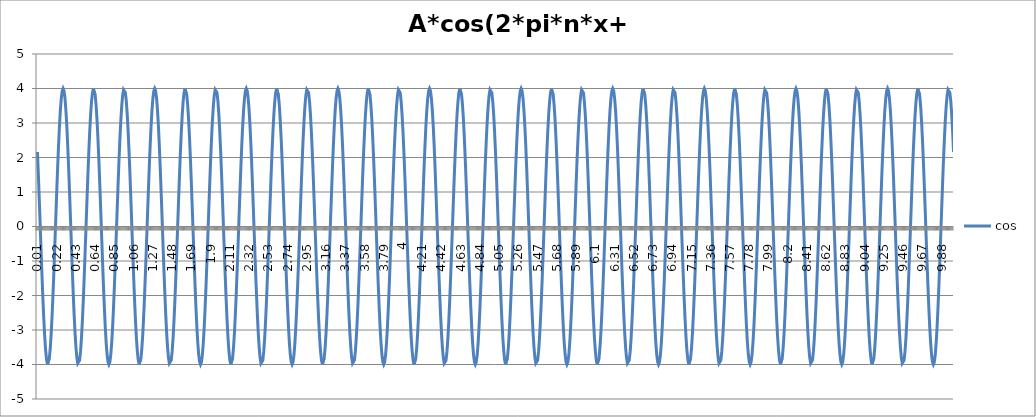
| Category | cos |
|---|---|
| 0.01 | 2.161 |
| 0.02 | 1.492 |
| 0.03 | 0.77 |
| 0.04 | 0.021 |
| 0.05 | -0.729 |
| 0.060000000000000005 | -1.453 |
| 0.07 | -2.125 |
| 0.08 | -2.723 |
| 0.09 | -3.224 |
| 0.09999999999999999 | -3.61 |
| 0.10999999999999999 | -3.869 |
| 0.11999999999999998 | -3.991 |
| 0.12999999999999998 | -3.971 |
| 0.13999999999999999 | -3.811 |
| 0.15 | -3.515 |
| 0.16 | -3.096 |
| 0.17 | -2.566 |
| 0.18000000000000002 | -1.946 |
| 0.19000000000000003 | -1.256 |
| 0.20000000000000004 | -0.522 |
| 0.21000000000000005 | 0.23 |
| 0.22000000000000006 | 0.974 |
| 0.23000000000000007 | 1.684 |
| 0.24000000000000007 | 2.334 |
| 0.25000000000000006 | 2.901 |
| 0.26000000000000006 | 3.366 |
| 0.2700000000000001 | 3.711 |
| 0.2800000000000001 | 3.925 |
| 0.2900000000000001 | 4 |
| 0.3000000000000001 | 3.933 |
| 0.3100000000000001 | 3.727 |
| 0.3200000000000001 | 3.389 |
| 0.3300000000000001 | 2.93 |
| 0.34000000000000014 | 2.368 |
| 0.35000000000000014 | 1.722 |
| 0.36000000000000015 | 1.015 |
| 0.37000000000000016 | 0.272 |
| 0.38000000000000017 | -0.48 |
| 0.3900000000000002 | -1.216 |
| 0.4000000000000002 | -1.908 |
| 0.4100000000000002 | -2.533 |
| 0.4200000000000002 | -3.068 |
| 0.4300000000000002 | -3.495 |
| 0.4400000000000002 | -3.798 |
| 0.45000000000000023 | -3.966 |
| 0.46000000000000024 | -3.993 |
| 0.47000000000000025 | -3.88 |
| 0.48000000000000026 | -3.628 |
| 0.49000000000000027 | -3.249 |
| 0.5000000000000002 | -2.754 |
| 0.5100000000000002 | -2.161 |
| 0.5200000000000002 | -1.492 |
| 0.5300000000000002 | -0.77 |
| 0.5400000000000003 | -0.021 |
| 0.5500000000000003 | 0.729 |
| 0.5600000000000003 | 1.453 |
| 0.5700000000000003 | 2.125 |
| 0.5800000000000003 | 2.723 |
| 0.5900000000000003 | 3.224 |
| 0.6000000000000003 | 3.61 |
| 0.6100000000000003 | 3.869 |
| 0.6200000000000003 | 3.991 |
| 0.6300000000000003 | 3.971 |
| 0.6400000000000003 | 3.811 |
| 0.6500000000000004 | 3.515 |
| 0.6600000000000004 | 3.096 |
| 0.6700000000000004 | 2.566 |
| 0.6800000000000004 | 1.946 |
| 0.6900000000000004 | 1.256 |
| 0.7000000000000004 | 0.522 |
| 0.7100000000000004 | -0.23 |
| 0.7200000000000004 | -0.974 |
| 0.7300000000000004 | -1.684 |
| 0.7400000000000004 | -2.334 |
| 0.7500000000000004 | -2.901 |
| 0.7600000000000005 | -3.366 |
| 0.7700000000000005 | -3.711 |
| 0.7800000000000005 | -3.925 |
| 0.7900000000000005 | -4 |
| 0.8000000000000005 | -3.933 |
| 0.8100000000000005 | -3.727 |
| 0.8200000000000005 | -3.389 |
| 0.8300000000000005 | -2.93 |
| 0.8400000000000005 | -2.368 |
| 0.8500000000000005 | -1.722 |
| 0.8600000000000005 | -1.015 |
| 0.8700000000000006 | -0.272 |
| 0.8800000000000006 | 0.48 |
| 0.8900000000000006 | 1.216 |
| 0.9000000000000006 | 1.908 |
| 0.9100000000000006 | 2.533 |
| 0.9200000000000006 | 3.068 |
| 0.9300000000000006 | 3.495 |
| 0.9400000000000006 | 3.798 |
| 0.9500000000000006 | 3.966 |
| 0.9600000000000006 | 3.993 |
| 0.9700000000000006 | 3.88 |
| 0.9800000000000006 | 3.628 |
| 0.9900000000000007 | 3.249 |
| 1.0000000000000007 | 2.754 |
| 1.0100000000000007 | 2.161 |
| 1.0200000000000007 | 1.492 |
| 1.0300000000000007 | 0.77 |
| 1.0400000000000007 | 0.021 |
| 1.0500000000000007 | -0.729 |
| 1.0600000000000007 | -1.453 |
| 1.0700000000000007 | -2.125 |
| 1.0800000000000007 | -2.723 |
| 1.0900000000000007 | -3.224 |
| 1.1000000000000008 | -3.61 |
| 1.1100000000000008 | -3.869 |
| 1.1200000000000008 | -3.991 |
| 1.1300000000000008 | -3.971 |
| 1.1400000000000008 | -3.811 |
| 1.1500000000000008 | -3.515 |
| 1.1600000000000008 | -3.096 |
| 1.1700000000000008 | -2.566 |
| 1.1800000000000008 | -1.946 |
| 1.1900000000000008 | -1.256 |
| 1.2000000000000008 | -0.522 |
| 1.2100000000000009 | 0.23 |
| 1.2200000000000009 | 0.974 |
| 1.2300000000000009 | 1.684 |
| 1.2400000000000009 | 2.334 |
| 1.2500000000000009 | 2.901 |
| 1.260000000000001 | 3.366 |
| 1.270000000000001 | 3.711 |
| 1.280000000000001 | 3.925 |
| 1.290000000000001 | 4 |
| 1.300000000000001 | 3.933 |
| 1.310000000000001 | 3.727 |
| 1.320000000000001 | 3.389 |
| 1.330000000000001 | 2.93 |
| 1.340000000000001 | 2.368 |
| 1.350000000000001 | 1.722 |
| 1.360000000000001 | 1.015 |
| 1.370000000000001 | 0.272 |
| 1.380000000000001 | -0.48 |
| 1.390000000000001 | -1.216 |
| 1.400000000000001 | -1.908 |
| 1.410000000000001 | -2.533 |
| 1.420000000000001 | -3.068 |
| 1.430000000000001 | -3.495 |
| 1.440000000000001 | -3.798 |
| 1.450000000000001 | -3.966 |
| 1.460000000000001 | -3.993 |
| 1.470000000000001 | -3.88 |
| 1.480000000000001 | -3.628 |
| 1.490000000000001 | -3.249 |
| 1.500000000000001 | -2.754 |
| 1.5100000000000011 | -2.161 |
| 1.5200000000000011 | -1.492 |
| 1.5300000000000011 | -0.77 |
| 1.5400000000000011 | -0.021 |
| 1.5500000000000012 | 0.729 |
| 1.5600000000000012 | 1.453 |
| 1.5700000000000012 | 2.125 |
| 1.5800000000000012 | 2.723 |
| 1.5900000000000012 | 3.224 |
| 1.6000000000000012 | 3.61 |
| 1.6100000000000012 | 3.869 |
| 1.6200000000000012 | 3.991 |
| 1.6300000000000012 | 3.971 |
| 1.6400000000000012 | 3.811 |
| 1.6500000000000012 | 3.515 |
| 1.6600000000000013 | 3.096 |
| 1.6700000000000013 | 2.566 |
| 1.6800000000000013 | 1.946 |
| 1.6900000000000013 | 1.256 |
| 1.7000000000000013 | 0.522 |
| 1.7100000000000013 | -0.23 |
| 1.7200000000000013 | -0.974 |
| 1.7300000000000013 | -1.684 |
| 1.7400000000000013 | -2.334 |
| 1.7500000000000013 | -2.901 |
| 1.7600000000000013 | -3.366 |
| 1.7700000000000014 | -3.711 |
| 1.7800000000000014 | -3.925 |
| 1.7900000000000014 | -4 |
| 1.8000000000000014 | -3.933 |
| 1.8100000000000014 | -3.727 |
| 1.8200000000000014 | -3.389 |
| 1.8300000000000014 | -2.93 |
| 1.8400000000000014 | -2.368 |
| 1.8500000000000014 | -1.722 |
| 1.8600000000000014 | -1.015 |
| 1.8700000000000014 | -0.272 |
| 1.8800000000000014 | 0.48 |
| 1.8900000000000015 | 1.216 |
| 1.9000000000000015 | 1.908 |
| 1.9100000000000015 | 2.533 |
| 1.9200000000000015 | 3.068 |
| 1.9300000000000015 | 3.495 |
| 1.9400000000000015 | 3.798 |
| 1.9500000000000015 | 3.966 |
| 1.9600000000000015 | 3.993 |
| 1.9700000000000015 | 3.88 |
| 1.9800000000000015 | 3.628 |
| 1.9900000000000015 | 3.249 |
| 2.0000000000000013 | 2.754 |
| 2.010000000000001 | 2.161 |
| 2.020000000000001 | 1.492 |
| 2.0300000000000007 | 0.77 |
| 2.0400000000000005 | 0.021 |
| 2.0500000000000003 | -0.729 |
| 2.06 | -1.453 |
| 2.07 | -2.125 |
| 2.0799999999999996 | -2.723 |
| 2.0899999999999994 | -3.224 |
| 2.099999999999999 | -3.61 |
| 2.109999999999999 | -3.869 |
| 2.1199999999999988 | -3.991 |
| 2.1299999999999986 | -3.971 |
| 2.1399999999999983 | -3.811 |
| 2.149999999999998 | -3.515 |
| 2.159999999999998 | -3.096 |
| 2.1699999999999977 | -2.566 |
| 2.1799999999999975 | -1.946 |
| 2.1899999999999973 | -1.256 |
| 2.199999999999997 | -0.522 |
| 2.209999999999997 | 0.23 |
| 2.2199999999999966 | 0.974 |
| 2.2299999999999964 | 1.684 |
| 2.239999999999996 | 2.334 |
| 2.249999999999996 | 2.901 |
| 2.259999999999996 | 3.366 |
| 2.2699999999999956 | 3.711 |
| 2.2799999999999954 | 3.925 |
| 2.289999999999995 | 4 |
| 2.299999999999995 | 3.933 |
| 2.3099999999999947 | 3.727 |
| 2.3199999999999945 | 3.389 |
| 2.3299999999999943 | 2.93 |
| 2.339999999999994 | 2.368 |
| 2.349999999999994 | 1.722 |
| 2.3599999999999937 | 1.015 |
| 2.3699999999999934 | 0.272 |
| 2.3799999999999932 | -0.48 |
| 2.389999999999993 | -1.216 |
| 2.399999999999993 | -1.908 |
| 2.4099999999999926 | -2.533 |
| 2.4199999999999924 | -3.068 |
| 2.429999999999992 | -3.495 |
| 2.439999999999992 | -3.798 |
| 2.4499999999999917 | -3.966 |
| 2.4599999999999915 | -3.993 |
| 2.4699999999999913 | -3.88 |
| 2.479999999999991 | -3.628 |
| 2.489999999999991 | -3.249 |
| 2.4999999999999907 | -2.754 |
| 2.5099999999999905 | -2.161 |
| 2.5199999999999902 | -1.492 |
| 2.52999999999999 | -0.77 |
| 2.53999999999999 | -0.021 |
| 2.5499999999999896 | 0.729 |
| 2.5599999999999894 | 1.453 |
| 2.569999999999989 | 2.125 |
| 2.579999999999989 | 2.723 |
| 2.5899999999999888 | 3.224 |
| 2.5999999999999885 | 3.61 |
| 2.6099999999999883 | 3.869 |
| 2.619999999999988 | 3.991 |
| 2.629999999999988 | 3.971 |
| 2.6399999999999877 | 3.811 |
| 2.6499999999999875 | 3.515 |
| 2.6599999999999873 | 3.096 |
| 2.669999999999987 | 2.566 |
| 2.679999999999987 | 1.946 |
| 2.6899999999999866 | 1.256 |
| 2.6999999999999864 | 0.522 |
| 2.709999999999986 | -0.23 |
| 2.719999999999986 | -0.974 |
| 2.7299999999999858 | -1.684 |
| 2.7399999999999856 | -2.334 |
| 2.7499999999999853 | -2.901 |
| 2.759999999999985 | -3.366 |
| 2.769999999999985 | -3.711 |
| 2.7799999999999847 | -3.925 |
| 2.7899999999999845 | -4 |
| 2.7999999999999843 | -3.933 |
| 2.809999999999984 | -3.727 |
| 2.819999999999984 | -3.389 |
| 2.8299999999999836 | -2.93 |
| 2.8399999999999834 | -2.368 |
| 2.849999999999983 | -1.722 |
| 2.859999999999983 | -1.015 |
| 2.869999999999983 | -0.272 |
| 2.8799999999999826 | 0.48 |
| 2.8899999999999824 | 1.216 |
| 2.899999999999982 | 1.908 |
| 2.909999999999982 | 2.533 |
| 2.9199999999999817 | 3.068 |
| 2.9299999999999815 | 3.495 |
| 2.9399999999999813 | 3.798 |
| 2.949999999999981 | 3.966 |
| 2.959999999999981 | 3.993 |
| 2.9699999999999807 | 3.88 |
| 2.9799999999999804 | 3.628 |
| 2.9899999999999802 | 3.249 |
| 2.99999999999998 | 2.754 |
| 3.00999999999998 | 2.161 |
| 3.0199999999999796 | 1.492 |
| 3.0299999999999794 | 0.77 |
| 3.039999999999979 | 0.021 |
| 3.049999999999979 | -0.729 |
| 3.0599999999999787 | -1.453 |
| 3.0699999999999785 | -2.125 |
| 3.0799999999999783 | -2.723 |
| 3.089999999999978 | -3.224 |
| 3.099999999999978 | -3.61 |
| 3.1099999999999777 | -3.869 |
| 3.1199999999999775 | -3.991 |
| 3.1299999999999772 | -3.971 |
| 3.139999999999977 | -3.811 |
| 3.149999999999977 | -3.515 |
| 3.1599999999999766 | -3.096 |
| 3.1699999999999764 | -2.566 |
| 3.179999999999976 | -1.946 |
| 3.189999999999976 | -1.256 |
| 3.1999999999999758 | -0.522 |
| 3.2099999999999755 | 0.23 |
| 3.2199999999999753 | 0.974 |
| 3.229999999999975 | 1.684 |
| 3.239999999999975 | 2.334 |
| 3.2499999999999747 | 2.901 |
| 3.2599999999999745 | 3.366 |
| 3.2699999999999743 | 3.711 |
| 3.279999999999974 | 3.925 |
| 3.289999999999974 | 4 |
| 3.2999999999999736 | 3.933 |
| 3.3099999999999734 | 3.727 |
| 3.319999999999973 | 3.389 |
| 3.329999999999973 | 2.93 |
| 3.3399999999999728 | 2.368 |
| 3.3499999999999726 | 1.722 |
| 3.3599999999999723 | 1.015 |
| 3.369999999999972 | 0.272 |
| 3.379999999999972 | -0.48 |
| 3.3899999999999717 | -1.216 |
| 3.3999999999999715 | -1.908 |
| 3.4099999999999713 | -2.533 |
| 3.419999999999971 | -3.068 |
| 3.429999999999971 | -3.495 |
| 3.4399999999999706 | -3.798 |
| 3.4499999999999704 | -3.966 |
| 3.45999999999997 | -3.993 |
| 3.46999999999997 | -3.88 |
| 3.47999999999997 | -3.628 |
| 3.4899999999999696 | -3.249 |
| 3.4999999999999694 | -2.754 |
| 3.509999999999969 | -2.161 |
| 3.519999999999969 | -1.492 |
| 3.5299999999999687 | -0.77 |
| 3.5399999999999685 | -0.021 |
| 3.5499999999999683 | 0.729 |
| 3.559999999999968 | 1.453 |
| 3.569999999999968 | 2.125 |
| 3.5799999999999677 | 2.723 |
| 3.5899999999999674 | 3.224 |
| 3.5999999999999672 | 3.61 |
| 3.609999999999967 | 3.869 |
| 3.619999999999967 | 3.991 |
| 3.6299999999999666 | 3.971 |
| 3.6399999999999664 | 3.811 |
| 3.649999999999966 | 3.515 |
| 3.659999999999966 | 3.096 |
| 3.6699999999999657 | 2.566 |
| 3.6799999999999655 | 1.946 |
| 3.6899999999999653 | 1.256 |
| 3.699999999999965 | 0.522 |
| 3.709999999999965 | -0.23 |
| 3.7199999999999647 | -0.974 |
| 3.7299999999999645 | -1.684 |
| 3.7399999999999642 | -2.334 |
| 3.749999999999964 | -2.901 |
| 3.759999999999964 | -3.366 |
| 3.7699999999999636 | -3.711 |
| 3.7799999999999634 | -3.925 |
| 3.789999999999963 | -4 |
| 3.799999999999963 | -3.933 |
| 3.8099999999999627 | -3.727 |
| 3.8199999999999625 | -3.389 |
| 3.8299999999999623 | -2.93 |
| 3.839999999999962 | -2.368 |
| 3.849999999999962 | -1.722 |
| 3.8599999999999617 | -1.015 |
| 3.8699999999999615 | -0.272 |
| 3.8799999999999613 | 0.48 |
| 3.889999999999961 | 1.216 |
| 3.899999999999961 | 1.908 |
| 3.9099999999999606 | 2.533 |
| 3.9199999999999604 | 3.068 |
| 3.92999999999996 | 3.495 |
| 3.93999999999996 | 3.798 |
| 3.9499999999999598 | 3.966 |
| 3.9599999999999596 | 3.993 |
| 3.9699999999999593 | 3.88 |
| 3.979999999999959 | 3.628 |
| 3.989999999999959 | 3.249 |
| 3.9999999999999587 | 2.754 |
| 4.009999999999959 | 2.161 |
| 4.019999999999959 | 1.492 |
| 4.0299999999999585 | 0.77 |
| 4.039999999999958 | 0.021 |
| 4.049999999999958 | -0.729 |
| 4.059999999999958 | -1.453 |
| 4.069999999999958 | -2.125 |
| 4.079999999999957 | -2.723 |
| 4.089999999999957 | -3.224 |
| 4.099999999999957 | -3.61 |
| 4.109999999999957 | -3.869 |
| 4.119999999999957 | -3.991 |
| 4.129999999999956 | -3.971 |
| 4.139999999999956 | -3.811 |
| 4.149999999999956 | -3.515 |
| 4.159999999999956 | -3.096 |
| 4.1699999999999555 | -2.566 |
| 4.179999999999955 | -1.946 |
| 4.189999999999955 | -1.256 |
| 4.199999999999955 | -0.522 |
| 4.209999999999955 | 0.23 |
| 4.2199999999999545 | 0.974 |
| 4.229999999999954 | 1.684 |
| 4.239999999999954 | 2.334 |
| 4.249999999999954 | 2.901 |
| 4.259999999999954 | 3.366 |
| 4.269999999999953 | 3.711 |
| 4.279999999999953 | 3.925 |
| 4.289999999999953 | 4 |
| 4.299999999999953 | 3.933 |
| 4.3099999999999525 | 3.727 |
| 4.319999999999952 | 3.389 |
| 4.329999999999952 | 2.93 |
| 4.339999999999952 | 2.368 |
| 4.349999999999952 | 1.722 |
| 4.3599999999999515 | 1.015 |
| 4.369999999999951 | 0.272 |
| 4.379999999999951 | -0.48 |
| 4.389999999999951 | -1.216 |
| 4.399999999999951 | -1.908 |
| 4.40999999999995 | -2.533 |
| 4.41999999999995 | -3.068 |
| 4.42999999999995 | -3.495 |
| 4.43999999999995 | -3.798 |
| 4.4499999999999496 | -3.966 |
| 4.459999999999949 | -3.993 |
| 4.469999999999949 | -3.88 |
| 4.479999999999949 | -3.628 |
| 4.489999999999949 | -3.249 |
| 4.4999999999999485 | -2.754 |
| 4.509999999999948 | -2.161 |
| 4.519999999999948 | -1.492 |
| 4.529999999999948 | -0.77 |
| 4.539999999999948 | -0.021 |
| 4.549999999999947 | 0.729 |
| 4.559999999999947 | 1.453 |
| 4.569999999999947 | 2.125 |
| 4.579999999999947 | 2.723 |
| 4.589999999999947 | 3.224 |
| 4.599999999999946 | 3.61 |
| 4.609999999999946 | 3.869 |
| 4.619999999999946 | 3.991 |
| 4.629999999999946 | 3.971 |
| 4.6399999999999455 | 3.811 |
| 4.649999999999945 | 3.515 |
| 4.659999999999945 | 3.096 |
| 4.669999999999945 | 2.566 |
| 4.679999999999945 | 1.946 |
| 4.689999999999944 | 1.256 |
| 4.699999999999944 | 0.522 |
| 4.709999999999944 | -0.23 |
| 4.719999999999944 | -0.974 |
| 4.729999999999944 | -1.684 |
| 4.739999999999943 | -2.334 |
| 4.749999999999943 | -2.901 |
| 4.759999999999943 | -3.366 |
| 4.769999999999943 | -3.711 |
| 4.7799999999999425 | -3.925 |
| 4.789999999999942 | -4 |
| 4.799999999999942 | -3.933 |
| 4.809999999999942 | -3.727 |
| 4.819999999999942 | -3.389 |
| 4.8299999999999415 | -2.93 |
| 4.839999999999941 | -2.368 |
| 4.849999999999941 | -1.722 |
| 4.859999999999941 | -1.015 |
| 4.869999999999941 | -0.272 |
| 4.87999999999994 | 0.48 |
| 4.88999999999994 | 1.216 |
| 4.89999999999994 | 1.908 |
| 4.90999999999994 | 2.533 |
| 4.9199999999999395 | 3.068 |
| 4.929999999999939 | 3.495 |
| 4.939999999999939 | 3.798 |
| 4.949999999999939 | 3.966 |
| 4.959999999999939 | 3.993 |
| 4.9699999999999385 | 3.88 |
| 4.979999999999938 | 3.628 |
| 4.989999999999938 | 3.249 |
| 4.999999999999938 | 2.754 |
| 5.009999999999938 | 2.161 |
| 5.019999999999937 | 1.492 |
| 5.029999999999937 | 0.77 |
| 5.039999999999937 | 0.021 |
| 5.049999999999937 | -0.729 |
| 5.0599999999999365 | -1.453 |
| 5.069999999999936 | -2.125 |
| 5.079999999999936 | -2.723 |
| 5.089999999999936 | -3.224 |
| 5.099999999999936 | -3.61 |
| 5.1099999999999355 | -3.869 |
| 5.119999999999935 | -3.991 |
| 5.129999999999935 | -3.971 |
| 5.139999999999935 | -3.811 |
| 5.149999999999935 | -3.515 |
| 5.159999999999934 | -3.096 |
| 5.169999999999934 | -2.566 |
| 5.179999999999934 | -1.946 |
| 5.189999999999934 | -1.256 |
| 5.199999999999934 | -0.522 |
| 5.209999999999933 | 0.23 |
| 5.219999999999933 | 0.974 |
| 5.229999999999933 | 1.684 |
| 5.239999999999933 | 2.334 |
| 5.2499999999999325 | 2.901 |
| 5.259999999999932 | 3.366 |
| 5.269999999999932 | 3.711 |
| 5.279999999999932 | 3.925 |
| 5.289999999999932 | 4 |
| 5.299999999999931 | 3.933 |
| 5.309999999999931 | 3.727 |
| 5.319999999999931 | 3.389 |
| 5.329999999999931 | 2.93 |
| 5.339999999999931 | 2.368 |
| 5.34999999999993 | 1.722 |
| 5.35999999999993 | 1.015 |
| 5.36999999999993 | 0.272 |
| 5.37999999999993 | -0.48 |
| 5.3899999999999295 | -1.216 |
| 5.399999999999929 | -1.908 |
| 5.409999999999929 | -2.533 |
| 5.419999999999929 | -3.068 |
| 5.429999999999929 | -3.495 |
| 5.4399999999999284 | -3.798 |
| 5.449999999999928 | -3.966 |
| 5.459999999999928 | -3.993 |
| 5.469999999999928 | -3.88 |
| 5.479999999999928 | -3.628 |
| 5.489999999999927 | -3.249 |
| 5.499999999999927 | -2.754 |
| 5.509999999999927 | -2.161 |
| 5.519999999999927 | -1.492 |
| 5.5299999999999265 | -0.77 |
| 5.539999999999926 | -0.021 |
| 5.549999999999926 | 0.729 |
| 5.559999999999926 | 1.453 |
| 5.569999999999926 | 2.125 |
| 5.5799999999999255 | 2.723 |
| 5.589999999999925 | 3.224 |
| 5.599999999999925 | 3.61 |
| 5.609999999999925 | 3.869 |
| 5.619999999999925 | 3.991 |
| 5.629999999999924 | 3.971 |
| 5.639999999999924 | 3.811 |
| 5.649999999999924 | 3.515 |
| 5.659999999999924 | 3.096 |
| 5.6699999999999235 | 2.566 |
| 5.679999999999923 | 1.946 |
| 5.689999999999923 | 1.256 |
| 5.699999999999923 | 0.522 |
| 5.709999999999923 | -0.23 |
| 5.7199999999999225 | -0.974 |
| 5.729999999999922 | -1.684 |
| 5.739999999999922 | -2.334 |
| 5.749999999999922 | -2.901 |
| 5.759999999999922 | -3.366 |
| 5.769999999999921 | -3.711 |
| 5.779999999999921 | -3.925 |
| 5.789999999999921 | -4 |
| 5.799999999999921 | -3.933 |
| 5.809999999999921 | -3.727 |
| 5.81999999999992 | -3.389 |
| 5.82999999999992 | -2.93 |
| 5.83999999999992 | -2.368 |
| 5.84999999999992 | -1.722 |
| 5.8599999999999195 | -1.015 |
| 5.869999999999919 | -0.272 |
| 5.879999999999919 | 0.48 |
| 5.889999999999919 | 1.216 |
| 5.899999999999919 | 1.908 |
| 5.909999999999918 | 2.533 |
| 5.919999999999918 | 3.068 |
| 5.929999999999918 | 3.495 |
| 5.939999999999918 | 3.798 |
| 5.949999999999918 | 3.966 |
| 5.959999999999917 | 3.993 |
| 5.969999999999917 | 3.88 |
| 5.979999999999917 | 3.628 |
| 5.989999999999917 | 3.249 |
| 5.9999999999999165 | 2.754 |
| 6.009999999999916 | 2.161 |
| 6.019999999999916 | 1.492 |
| 6.029999999999916 | 0.77 |
| 6.039999999999916 | 0.021 |
| 6.0499999999999154 | -0.729 |
| 6.059999999999915 | -1.453 |
| 6.069999999999915 | -2.125 |
| 6.079999999999915 | -2.723 |
| 6.089999999999915 | -3.224 |
| 6.099999999999914 | -3.61 |
| 6.109999999999914 | -3.869 |
| 6.119999999999914 | -3.991 |
| 6.129999999999914 | -3.971 |
| 6.1399999999999135 | -3.811 |
| 6.149999999999913 | -3.515 |
| 6.159999999999913 | -3.096 |
| 6.169999999999913 | -2.566 |
| 6.179999999999913 | -1.946 |
| 6.1899999999999125 | -1.256 |
| 6.199999999999912 | -0.522 |
| 6.209999999999912 | 0.23 |
| 6.219999999999912 | 0.974 |
| 6.229999999999912 | 1.684 |
| 6.239999999999911 | 2.334 |
| 6.249999999999911 | 2.901 |
| 6.259999999999911 | 3.366 |
| 6.269999999999911 | 3.711 |
| 6.2799999999999105 | 3.925 |
| 6.28999999999991 | 4 |
| 6.29999999999991 | 3.933 |
| 6.30999999999991 | 3.727 |
| 6.31999999999991 | 3.389 |
| 6.3299999999999095 | 2.93 |
| 6.339999999999909 | 2.368 |
| 6.349999999999909 | 1.722 |
| 6.359999999999909 | 1.015 |
| 6.369999999999909 | 0.272 |
| 6.379999999999908 | -0.48 |
| 6.389999999999908 | -1.216 |
| 6.399999999999908 | -1.908 |
| 6.409999999999908 | -2.533 |
| 6.419999999999908 | -3.068 |
| 6.429999999999907 | -3.495 |
| 6.439999999999907 | -3.798 |
| 6.449999999999907 | -3.966 |
| 6.459999999999907 | -3.993 |
| 6.4699999999999065 | -3.88 |
| 6.479999999999906 | -3.628 |
| 6.489999999999906 | -3.249 |
| 6.499999999999906 | -2.754 |
| 6.509999999999906 | -2.161 |
| 6.519999999999905 | -1.492 |
| 6.529999999999905 | -0.77 |
| 6.539999999999905 | -0.021 |
| 6.549999999999905 | 0.729 |
| 6.559999999999905 | 1.453 |
| 6.569999999999904 | 2.125 |
| 6.579999999999904 | 2.723 |
| 6.589999999999904 | 3.224 |
| 6.599999999999904 | 3.61 |
| 6.6099999999999035 | 3.869 |
| 6.619999999999903 | 3.991 |
| 6.629999999999903 | 3.971 |
| 6.639999999999903 | 3.811 |
| 6.649999999999903 | 3.515 |
| 6.659999999999902 | 3.096 |
| 6.669999999999902 | 2.566 |
| 6.679999999999902 | 1.946 |
| 6.689999999999902 | 1.256 |
| 6.699999999999902 | 0.522 |
| 6.709999999999901 | -0.23 |
| 6.719999999999901 | -0.974 |
| 6.729999999999901 | -1.684 |
| 6.739999999999901 | -2.334 |
| 6.7499999999999005 | -2.901 |
| 6.7599999999999 | -3.366 |
| 6.7699999999999 | -3.711 |
| 6.7799999999999 | -3.925 |
| 6.7899999999999 | -4 |
| 6.7999999999998995 | -3.933 |
| 6.809999999999899 | -3.727 |
| 6.819999999999899 | -3.389 |
| 6.829999999999899 | -2.93 |
| 6.839999999999899 | -2.368 |
| 6.849999999999898 | -1.722 |
| 6.859999999999898 | -1.015 |
| 6.869999999999898 | -0.272 |
| 6.879999999999898 | 0.48 |
| 6.8899999999998975 | 1.216 |
| 6.899999999999897 | 1.908 |
| 6.909999999999897 | 2.533 |
| 6.919999999999897 | 3.068 |
| 6.929999999999897 | 3.495 |
| 6.9399999999998965 | 3.798 |
| 6.949999999999896 | 3.966 |
| 6.959999999999896 | 3.993 |
| 6.969999999999896 | 3.88 |
| 6.979999999999896 | 3.628 |
| 6.989999999999895 | 3.249 |
| 6.999999999999895 | 2.754 |
| 7.009999999999895 | 2.161 |
| 7.019999999999895 | 1.492 |
| 7.0299999999998946 | 0.77 |
| 7.039999999999894 | 0.021 |
| 7.049999999999894 | -0.729 |
| 7.059999999999894 | -1.453 |
| 7.069999999999894 | -2.125 |
| 7.0799999999998935 | -2.723 |
| 7.089999999999893 | -3.224 |
| 7.099999999999893 | -3.61 |
| 7.109999999999893 | -3.869 |
| 7.119999999999893 | -3.991 |
| 7.129999999999892 | -3.971 |
| 7.139999999999892 | -3.811 |
| 7.149999999999892 | -3.515 |
| 7.159999999999892 | -3.096 |
| 7.169999999999892 | -2.566 |
| 7.179999999999891 | -1.946 |
| 7.189999999999891 | -1.256 |
| 7.199999999999891 | -0.522 |
| 7.209999999999891 | 0.23 |
| 7.2199999999998905 | 0.974 |
| 7.22999999999989 | 1.684 |
| 7.23999999999989 | 2.334 |
| 7.24999999999989 | 2.901 |
| 7.25999999999989 | 3.366 |
| 7.269999999999889 | 3.711 |
| 7.279999999999889 | 3.925 |
| 7.289999999999889 | 4 |
| 7.299999999999889 | 3.933 |
| 7.309999999999889 | 3.727 |
| 7.319999999999888 | 3.389 |
| 7.329999999999888 | 2.93 |
| 7.339999999999888 | 2.368 |
| 7.349999999999888 | 1.722 |
| 7.3599999999998875 | 1.015 |
| 7.369999999999887 | 0.272 |
| 7.379999999999887 | -0.48 |
| 7.389999999999887 | -1.216 |
| 7.399999999999887 | -1.908 |
| 7.4099999999998865 | -2.533 |
| 7.419999999999886 | -3.068 |
| 7.429999999999886 | -3.495 |
| 7.439999999999886 | -3.798 |
| 7.449999999999886 | -3.966 |
| 7.459999999999885 | -3.993 |
| 7.469999999999885 | -3.88 |
| 7.479999999999885 | -3.628 |
| 7.489999999999885 | -3.249 |
| 7.4999999999998845 | -2.754 |
| 7.509999999999884 | -2.161 |
| 7.519999999999884 | -1.492 |
| 7.529999999999884 | -0.77 |
| 7.539999999999884 | -0.021 |
| 7.5499999999998835 | 0.729 |
| 7.559999999999883 | 1.453 |
| 7.569999999999883 | 2.125 |
| 7.579999999999883 | 2.723 |
| 7.589999999999883 | 3.224 |
| 7.599999999999882 | 3.61 |
| 7.609999999999882 | 3.869 |
| 7.619999999999882 | 3.991 |
| 7.629999999999882 | 3.971 |
| 7.6399999999998816 | 3.811 |
| 7.649999999999881 | 3.515 |
| 7.659999999999881 | 3.096 |
| 7.669999999999881 | 2.566 |
| 7.679999999999881 | 1.946 |
| 7.6899999999998805 | 1.256 |
| 7.69999999999988 | 0.522 |
| 7.70999999999988 | -0.23 |
| 7.71999999999988 | -0.974 |
| 7.72999999999988 | -1.684 |
| 7.739999999999879 | -2.334 |
| 7.749999999999879 | -2.901 |
| 7.759999999999879 | -3.366 |
| 7.769999999999879 | -3.711 |
| 7.779999999999879 | -3.925 |
| 7.789999999999878 | -4 |
| 7.799999999999878 | -3.933 |
| 7.809999999999878 | -3.727 |
| 7.819999999999878 | -3.389 |
| 7.8299999999998775 | -2.93 |
| 7.839999999999877 | -2.368 |
| 7.849999999999877 | -1.722 |
| 7.859999999999877 | -1.015 |
| 7.869999999999877 | -0.272 |
| 7.879999999999876 | 0.48 |
| 7.889999999999876 | 1.216 |
| 7.899999999999876 | 1.908 |
| 7.909999999999876 | 2.533 |
| 7.919999999999876 | 3.068 |
| 7.929999999999875 | 3.495 |
| 7.939999999999875 | 3.798 |
| 7.949999999999875 | 3.966 |
| 7.959999999999875 | 3.993 |
| 7.9699999999998745 | 3.88 |
| 7.979999999999874 | 3.628 |
| 7.989999999999874 | 3.249 |
| 7.999999999999874 | 2.754 |
| 8.009999999999874 | 2.161 |
| 8.019999999999873 | 1.492 |
| 8.029999999999873 | 0.77 |
| 8.039999999999873 | 0.021 |
| 8.049999999999873 | -0.729 |
| 8.059999999999873 | -1.453 |
| 8.069999999999872 | -2.125 |
| 8.079999999999872 | -2.723 |
| 8.089999999999872 | -3.224 |
| 8.099999999999872 | -3.61 |
| 8.109999999999872 | -3.869 |
| 8.119999999999871 | -3.991 |
| 8.129999999999871 | -3.971 |
| 8.139999999999871 | -3.811 |
| 8.14999999999987 | -3.515 |
| 8.15999999999987 | -3.096 |
| 8.16999999999987 | -2.566 |
| 8.17999999999987 | -1.946 |
| 8.18999999999987 | -1.256 |
| 8.19999999999987 | -0.522 |
| 8.20999999999987 | 0.23 |
| 8.21999999999987 | 0.974 |
| 8.229999999999869 | 1.684 |
| 8.239999999999869 | 2.334 |
| 8.249999999999869 | 2.901 |
| 8.259999999999868 | 3.366 |
| 8.269999999999868 | 3.711 |
| 8.279999999999868 | 3.925 |
| 8.289999999999868 | 4 |
| 8.299999999999867 | 3.933 |
| 8.309999999999867 | 3.727 |
| 8.319999999999867 | 3.389 |
| 8.329999999999867 | 2.93 |
| 8.339999999999867 | 2.368 |
| 8.349999999999866 | 1.722 |
| 8.359999999999866 | 1.015 |
| 8.369999999999866 | 0.272 |
| 8.379999999999866 | -0.48 |
| 8.389999999999866 | -1.216 |
| 8.399999999999865 | -1.908 |
| 8.409999999999865 | -2.533 |
| 8.419999999999865 | -3.068 |
| 8.429999999999865 | -3.495 |
| 8.439999999999864 | -3.798 |
| 8.449999999999864 | -3.966 |
| 8.459999999999864 | -3.993 |
| 8.469999999999864 | -3.88 |
| 8.479999999999864 | -3.628 |
| 8.489999999999863 | -3.249 |
| 8.499999999999863 | -2.754 |
| 8.509999999999863 | -2.161 |
| 8.519999999999863 | -1.492 |
| 8.529999999999863 | -0.77 |
| 8.539999999999862 | -0.021 |
| 8.549999999999862 | 0.729 |
| 8.559999999999862 | 1.453 |
| 8.569999999999862 | 2.125 |
| 8.579999999999862 | 2.723 |
| 8.589999999999861 | 3.224 |
| 8.599999999999861 | 3.61 |
| 8.60999999999986 | 3.869 |
| 8.61999999999986 | 3.991 |
| 8.62999999999986 | 3.971 |
| 8.63999999999986 | 3.811 |
| 8.64999999999986 | 3.515 |
| 8.65999999999986 | 3.096 |
| 8.66999999999986 | 2.566 |
| 8.67999999999986 | 1.946 |
| 8.68999999999986 | 1.256 |
| 8.699999999999859 | 0.522 |
| 8.709999999999859 | -0.23 |
| 8.719999999999859 | -0.974 |
| 8.729999999999858 | -1.684 |
| 8.739999999999858 | -2.334 |
| 8.749999999999858 | -2.901 |
| 8.759999999999858 | -3.366 |
| 8.769999999999857 | -3.711 |
| 8.779999999999857 | -3.925 |
| 8.789999999999857 | -4 |
| 8.799999999999857 | -3.933 |
| 8.809999999999857 | -3.727 |
| 8.819999999999856 | -3.389 |
| 8.829999999999856 | -2.93 |
| 8.839999999999856 | -2.368 |
| 8.849999999999856 | -1.722 |
| 8.859999999999856 | -1.015 |
| 8.869999999999855 | -0.272 |
| 8.879999999999855 | 0.48 |
| 8.889999999999855 | 1.216 |
| 8.899999999999855 | 1.908 |
| 8.909999999999854 | 2.533 |
| 8.919999999999854 | 3.068 |
| 8.929999999999854 | 3.495 |
| 8.939999999999854 | 3.798 |
| 8.949999999999854 | 3.966 |
| 8.959999999999853 | 3.993 |
| 8.969999999999853 | 3.88 |
| 8.979999999999853 | 3.628 |
| 8.989999999999853 | 3.249 |
| 8.999999999999853 | 2.754 |
| 9.009999999999852 | 2.161 |
| 9.019999999999852 | 1.492 |
| 9.029999999999852 | 0.77 |
| 9.039999999999852 | 0.021 |
| 9.049999999999851 | -0.729 |
| 9.059999999999851 | -1.453 |
| 9.069999999999851 | -2.125 |
| 9.07999999999985 | -2.723 |
| 9.08999999999985 | -3.224 |
| 9.09999999999985 | -3.61 |
| 9.10999999999985 | -3.869 |
| 9.11999999999985 | -3.991 |
| 9.12999999999985 | -3.971 |
| 9.13999999999985 | -3.811 |
| 9.14999999999985 | -3.515 |
| 9.15999999999985 | -3.096 |
| 9.169999999999849 | -2.566 |
| 9.179999999999849 | -1.946 |
| 9.189999999999849 | -1.256 |
| 9.199999999999848 | -0.522 |
| 9.209999999999848 | 0.23 |
| 9.219999999999848 | 0.974 |
| 9.229999999999848 | 1.684 |
| 9.239999999999847 | 2.334 |
| 9.249999999999847 | 2.901 |
| 9.259999999999847 | 3.366 |
| 9.269999999999847 | 3.711 |
| 9.279999999999847 | 3.925 |
| 9.289999999999846 | 4 |
| 9.299999999999846 | 3.933 |
| 9.309999999999846 | 3.727 |
| 9.319999999999846 | 3.389 |
| 9.329999999999846 | 2.93 |
| 9.339999999999845 | 2.368 |
| 9.349999999999845 | 1.722 |
| 9.359999999999845 | 1.015 |
| 9.369999999999845 | 0.272 |
| 9.379999999999844 | -0.48 |
| 9.389999999999844 | -1.216 |
| 9.399999999999844 | -1.908 |
| 9.409999999999844 | -2.533 |
| 9.419999999999844 | -3.068 |
| 9.429999999999843 | -3.495 |
| 9.439999999999843 | -3.798 |
| 9.449999999999843 | -3.966 |
| 9.459999999999843 | -3.993 |
| 9.469999999999843 | -3.88 |
| 9.479999999999842 | -3.628 |
| 9.489999999999842 | -3.249 |
| 9.499999999999842 | -2.754 |
| 9.509999999999842 | -2.161 |
| 9.519999999999841 | -1.492 |
| 9.529999999999841 | -0.77 |
| 9.539999999999841 | -0.021 |
| 9.54999999999984 | 0.729 |
| 9.55999999999984 | 1.453 |
| 9.56999999999984 | 2.125 |
| 9.57999999999984 | 2.723 |
| 9.58999999999984 | 3.224 |
| 9.59999999999984 | 3.61 |
| 9.60999999999984 | 3.869 |
| 9.61999999999984 | 3.991 |
| 9.62999999999984 | 3.971 |
| 9.639999999999839 | 3.811 |
| 9.649999999999839 | 3.515 |
| 9.659999999999838 | 3.096 |
| 9.669999999999838 | 2.566 |
| 9.679999999999838 | 1.946 |
| 9.689999999999838 | 1.256 |
| 9.699999999999838 | 0.522 |
| 9.709999999999837 | -0.23 |
| 9.719999999999837 | -0.974 |
| 9.729999999999837 | -1.684 |
| 9.739999999999837 | -2.334 |
| 9.749999999999837 | -2.901 |
| 9.759999999999836 | -3.366 |
| 9.769999999999836 | -3.711 |
| 9.779999999999836 | -3.925 |
| 9.789999999999836 | -4 |
| 9.799999999999836 | -3.933 |
| 9.809999999999835 | -3.727 |
| 9.819999999999835 | -3.389 |
| 9.829999999999835 | -2.93 |
| 9.839999999999835 | -2.368 |
| 9.849999999999834 | -1.722 |
| 9.859999999999834 | -1.015 |
| 9.869999999999834 | -0.272 |
| 9.879999999999834 | 0.48 |
| 9.889999999999834 | 1.216 |
| 9.899999999999833 | 1.908 |
| 9.909999999999833 | 2.533 |
| 9.919999999999833 | 3.068 |
| 9.929999999999833 | 3.495 |
| 9.939999999999833 | 3.798 |
| 9.949999999999832 | 3.966 |
| 9.959999999999832 | 3.993 |
| 9.969999999999832 | 3.88 |
| 9.979999999999832 | 3.628 |
| 9.989999999999831 | 3.249 |
| 9.999999999999831 | 2.754 |